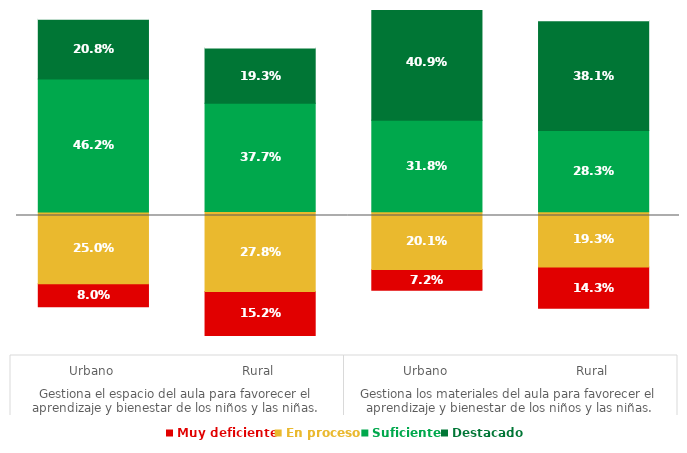
| Category | Series 0 | Muy deficiente | En proceso | Suficiente | Destacado | Series 5 |
|---|---|---|---|---|---|---|
| 0 | 0.17 | 0.08 | 0.25 | 0.462 | 0.208 | 0.13 |
| 1 | 0.07 | 0.152 | 0.278 | 0.377 | 0.193 | 0.23 |
| 2 | 0.227 | 0.072 | 0.201 | 0.318 | 0.409 | 0.073 |
| 3 | 0.164 | 0.143 | 0.193 | 0.283 | 0.381 | 0.136 |